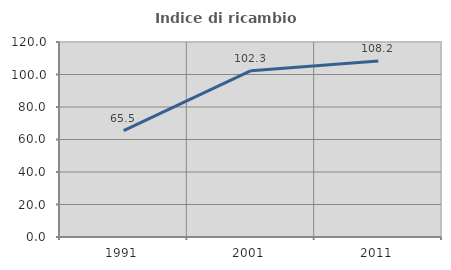
| Category | Indice di ricambio occupazionale  |
|---|---|
| 1991.0 | 65.517 |
| 2001.0 | 102.335 |
| 2011.0 | 108.243 |